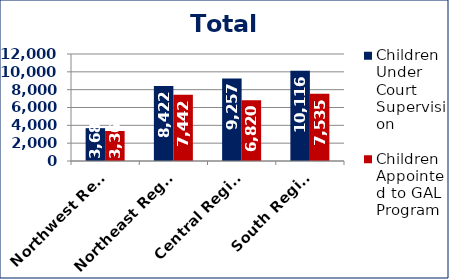
| Category | Children Under Court Supervision  | Children Appointed to GAL Program  |
|---|---|---|
| Northwest Region | 3681 | 3363 |
| Northeast Region | 8422 | 7442 |
| Central Region | 9257 | 6820 |
| South Region | 10116 | 7535 |